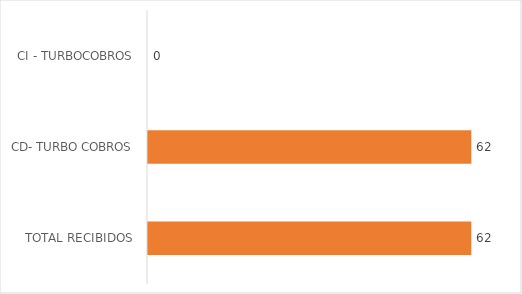
| Category | Series 0 |
|---|---|
| TOTAL RECIBIDOS | 62 |
| CD- TURBO COBROS | 62 |
| CI - TURBOCOBROS | 0 |